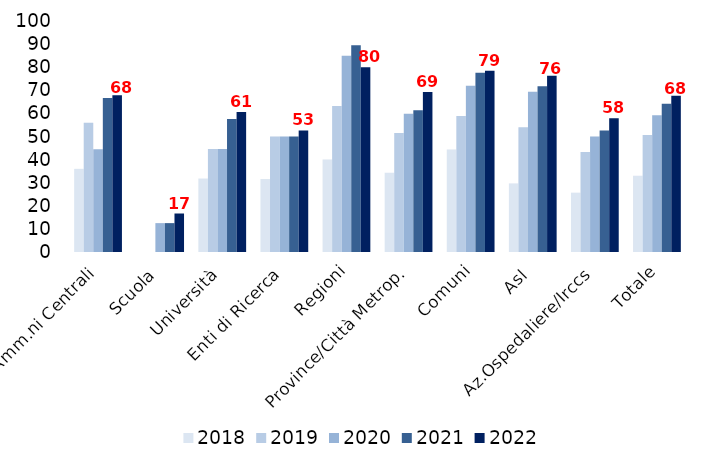
| Category | 2018 | 2019 | 2020 | 2021 | 2022 |
|---|---|---|---|---|---|
| Amm.ni Centrali | 36 | 56 | 44.444 | 66.667 | 67.857 |
| Scuola | 0 | 0 | 12.5 | 12.5 | 16.667 |
| Università | 31.818 | 44.615 | 44.615 | 57.576 | 60.606 |
| Enti di Ricerca | 31.579 | 50 | 50 | 50 | 52.632 |
| Regioni | 40 | 63.158 | 85 | 89.474 | 80 |
| Province/Città Metrop. | 34.314 | 51.485 | 59.804 | 61.386 | 69.307 |
| Comuni | 44.34 | 58.879 | 71.963 | 77.57 | 78.505 |
| Asl | 29.703 | 54 | 69.388 | 71.717 | 76.289 |
| Az.Ospedaliere/Irccs | 25.676 | 43.243 | 50 | 52.632 | 57.895 |
| Totale | 33.019 | 50.669 | 59.168 | 64.218 | 67.669 |